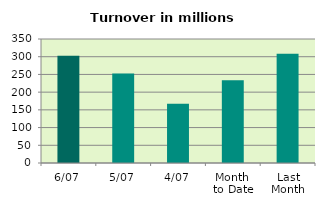
| Category | Series 0 |
|---|---|
| 6/07 | 302.463 |
| 5/07 | 252.416 |
| 4/07 | 167.424 |
| Month 
to Date | 233.344 |
| Last
Month | 308.534 |